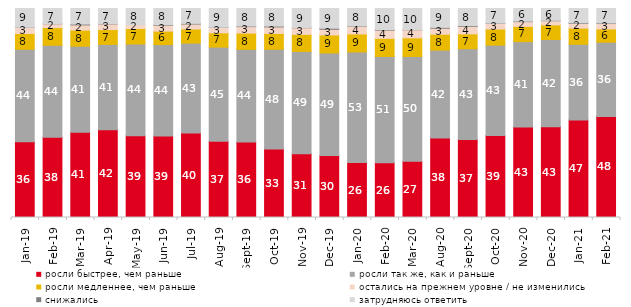
| Category | росли быстрее, чем раньше | росли так же, как и раньше | росли медленнее, чем раньше | остались на прежнем уровне / не изменились | снижались | затрудняюсь ответить |
|---|---|---|---|---|---|---|
| 2019-01-01 | 36.25 | 44.25 | 7.55 | 2.85 | 0.1 | 9 |
| 2019-02-01 | 38.35 | 44.05 | 8.45 | 1.85 | 0.05 | 7.25 |
| 2019-03-01 | 40.825 | 41.124 | 7.708 | 2.486 | 0.398 | 7.459 |
| 2019-04-01 | 42.03 | 40.792 | 7.079 | 2.723 | 0.149 | 7.228 |
| 2019-05-01 | 39.079 | 43.933 | 7.429 | 1.783 | 0 | 7.776 |
| 2019-06-01 | 39.052 | 43.691 | 6.434 | 2.843 | 0.249 | 7.731 |
| 2019-07-01 | 40.396 | 43.02 | 6.782 | 2.376 | 0.297 | 7.129 |
| 2019-08-01 | 36.513 | 45.005 | 6.843 | 2.547 | 0.1 | 8.991 |
| 2019-09-01 | 36.139 | 44.307 | 7.772 | 3.119 | 0.248 | 8.416 |
| 2019-10-01 | 32.822 | 47.673 | 7.574 | 3.119 | 0.396 | 8.416 |
| 2019-11-01 | 30.545 | 48.911 | 8.168 | 3.168 | 0.099 | 9.109 |
| 2019-12-01 | 29.653 | 49.059 | 8.614 | 2.723 | 0.495 | 9.455 |
| 2020-01-01 | 26.287 | 52.921 | 8.614 | 3.713 | 0.149 | 8.317 |
| 2020-02-01 | 26.139 | 50.891 | 8.663 | 3.96 | 0.297 | 10.05 |
| 2020-03-01 | 26.971 | 50.074 | 8.924 | 3.867 | 0.099 | 10.064 |
| 2020-08-01 | 38.083 | 42.006 | 7.597 | 2.88 | 0.397 | 9.037 |
| 2020-09-01 | 37.282 | 43.454 | 7.118 | 3.534 | 0.348 | 8.263 |
| 2020-10-01 | 39.213 | 43.249 | 7.723 | 2.74 | 0.1 | 6.976 |
| 2020-11-01 | 43.3 | 40.85 | 7.3 | 2.25 | 0.25 | 6.05 |
| 2020-12-01 | 43.381 | 41.795 | 6.991 | 1.983 | 0.198 | 5.652 |
| 2021-01-01 | 46.696 | 36.165 | 7.75 | 2.285 | 0.298 | 6.806 |
| 2021-02-01 | 48.337 | 35.533 | 6.352 | 2.581 | 0.248 | 6.948 |